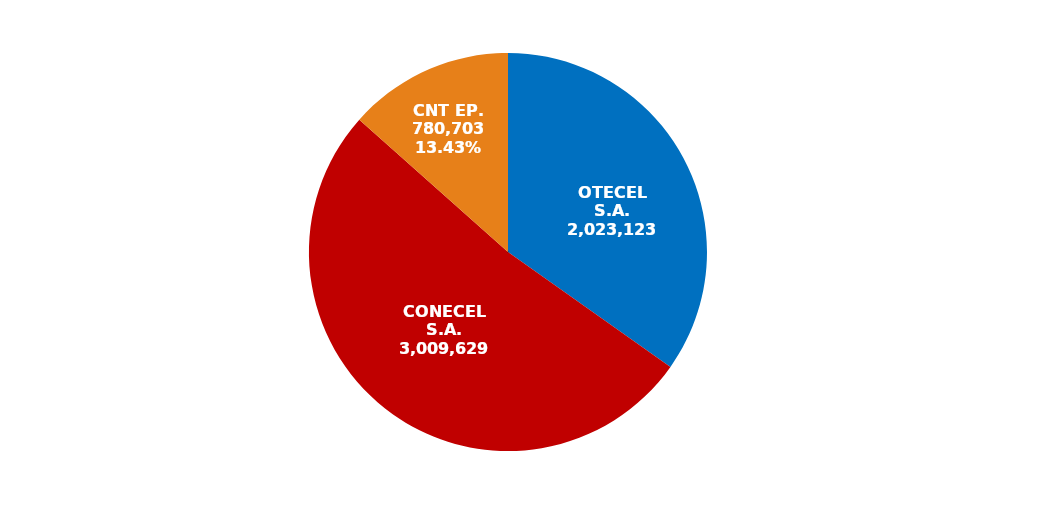
| Category | Series 0 |
|---|---|
| OTECEL S.A. | 2023123 |
| CONECEL S.A. | 3009629 |
| CNT EP. | 780703 |